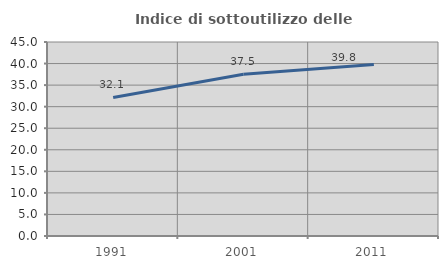
| Category | Indice di sottoutilizzo delle abitazioni  |
|---|---|
| 1991.0 | 32.144 |
| 2001.0 | 37.505 |
| 2011.0 | 39.791 |